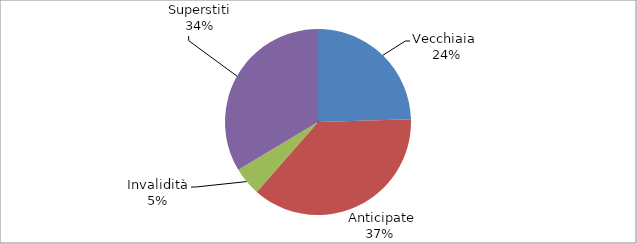
| Category | Series 0 |
|---|---|
| Vecchiaia  | 21441 |
|  Anticipate | 32256 |
| Invalidità | 4310 |
| Superstiti | 29359 |